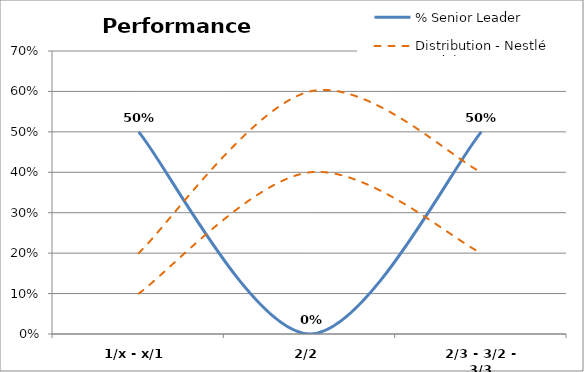
| Category | % Senior Leader | Distribution - Nestlé Guideline |
|---|---|---|
| 1/x - x/1 | 0.5 | 0.2 |
| 2/2 | 0 | 0.6 |
| 2/3 - 3/2 - 3/3 | 0.5 | 0.4 |